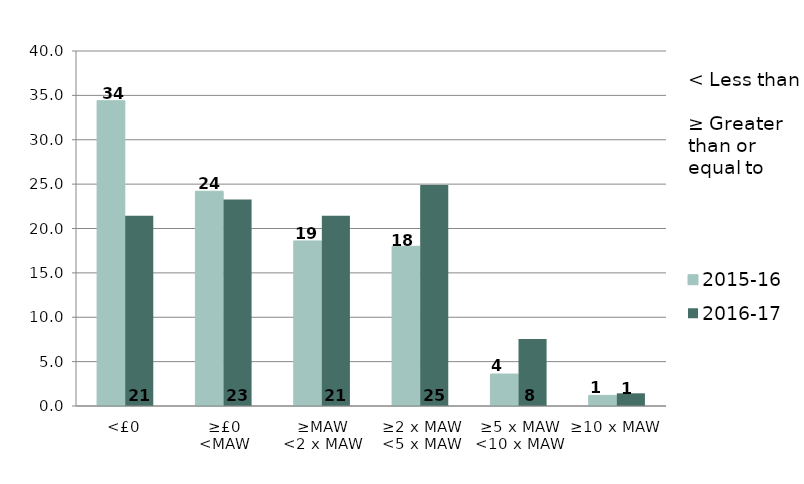
| Category | 2015-16 | 2016-17 |
|---|---|---|
| <£0 | 34.4 | 21.43 |
| ≥£0
<MAW | 24.2 | 23.27 |
| ≥MAW
<2 x MAW | 18.6 | 21.43 |
| ≥2 x MAW
<5 x MAW | 18 | 24.9 |
| ≥5 x MAW
<10 x MAW | 3.6 | 7.55 |
| ≥10 x MAW | 1.2 | 1.43 |